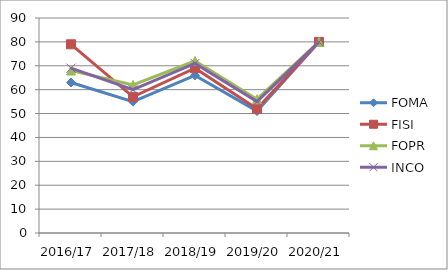
| Category | FOMA | FISI | FOPR | INCO |
|---|---|---|---|---|
| 2016/17 | 63 | 79 | 68 | 69 |
| 2017/18 | 55 | 57 | 62 | 60 |
| 2018/19 | 66 | 69 | 72 | 71 |
| 2019/20 | 51 | 52 | 56 | 55 |
| 2020/21 | 80 | 80 | 80 | 80 |